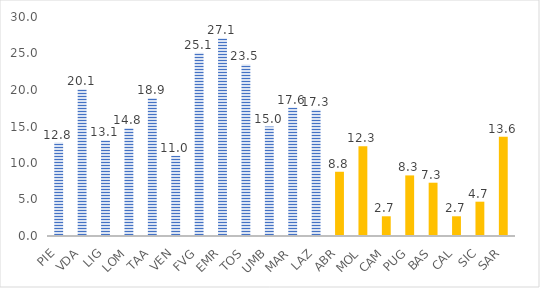
| Category | nidi e sezioni primavera |
|---|---|
| PIE | 12.8 |
| VDA | 20.1 |
| LIG | 13.1 |
| LOM | 14.8 |
| TAA | 18.9 |
| VEN | 11 |
| FVG | 25.1 |
| EMR | 27.1 |
| TOS | 23.5 |
| UMB | 15 |
| MAR | 17.6 |
| LAZ | 17.3 |
| ABR | 8.8 |
| MOL | 12.3 |
| CAM | 2.7 |
| PUG | 8.3 |
| BAS | 7.3 |
| CAL | 2.7 |
| SIC | 4.7 |
| SAR | 13.6 |